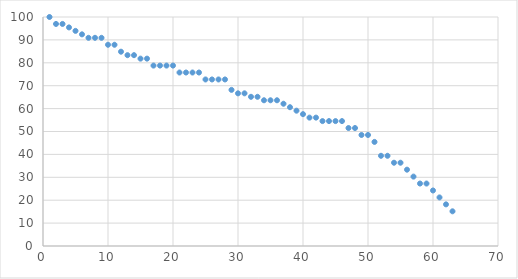
| Category | Series 0 |
|---|---|
| 0 | 100 |
| 1 | 96.97 |
| 2 | 96.97 |
| 3 | 95.455 |
| 4 | 93.939 |
| 5 | 92.424 |
| 6 | 90.909 |
| 7 | 90.909 |
| 8 | 90.909 |
| 9 | 87.879 |
| 10 | 87.879 |
| 11 | 84.848 |
| 12 | 83.333 |
| 13 | 83.333 |
| 14 | 81.818 |
| 15 | 81.818 |
| 16 | 78.788 |
| 17 | 78.788 |
| 18 | 78.788 |
| 19 | 78.788 |
| 20 | 75.758 |
| 21 | 75.758 |
| 22 | 75.758 |
| 23 | 75.758 |
| 24 | 72.727 |
| 25 | 72.727 |
| 26 | 72.727 |
| 27 | 72.727 |
| 28 | 68.182 |
| 29 | 66.667 |
| 30 | 66.667 |
| 31 | 65.152 |
| 32 | 65.152 |
| 33 | 63.636 |
| 34 | 63.636 |
| 35 | 63.636 |
| 36 | 62.121 |
| 37 | 60.606 |
| 38 | 59.091 |
| 39 | 57.576 |
| 40 | 56.061 |
| 41 | 56.061 |
| 42 | 54.545 |
| 43 | 54.545 |
| 44 | 54.545 |
| 45 | 54.545 |
| 46 | 51.515 |
| 47 | 51.515 |
| 48 | 48.485 |
| 49 | 48.485 |
| 50 | 45.455 |
| 51 | 39.394 |
| 52 | 39.394 |
| 53 | 36.364 |
| 54 | 36.364 |
| 55 | 33.333 |
| 56 | 30.303 |
| 57 | 27.273 |
| 58 | 27.273 |
| 59 | 24.242 |
| 60 | 21.212 |
| 61 | 18.182 |
| 62 | 15.152 |